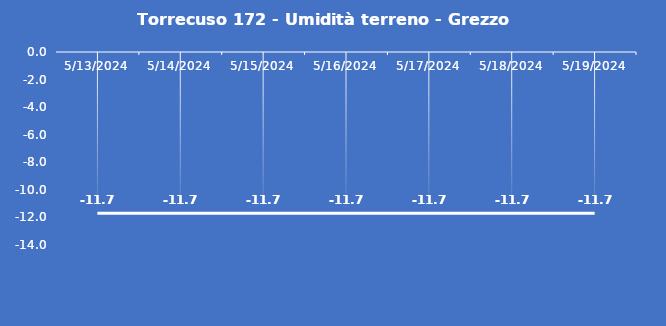
| Category | Torrecuso 172 - Umidità terreno - Grezzo (%VWC) |
|---|---|
| 5/13/24 | -11.7 |
| 5/14/24 | -11.7 |
| 5/15/24 | -11.7 |
| 5/16/24 | -11.7 |
| 5/17/24 | -11.7 |
| 5/18/24 | -11.7 |
| 5/19/24 | -11.7 |